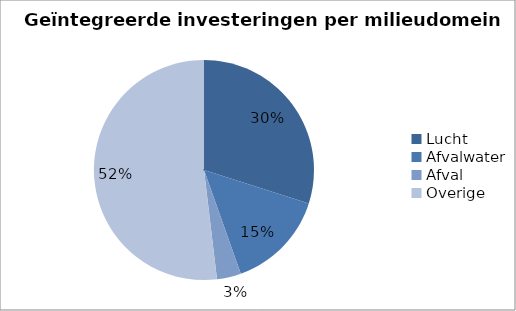
| Category | Series 0 |
|---|---|
| Lucht | 56.947 |
| Afvalwater | 27.895 |
| Afval | 6.75 |
| Overige | 98.764 |